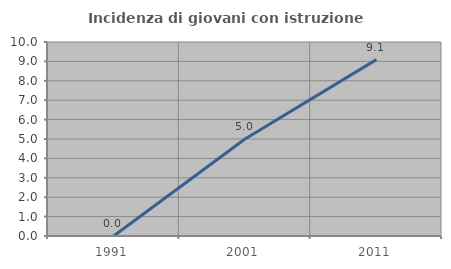
| Category | Incidenza di giovani con istruzione universitaria |
|---|---|
| 1991.0 | 0 |
| 2001.0 | 5 |
| 2011.0 | 9.091 |